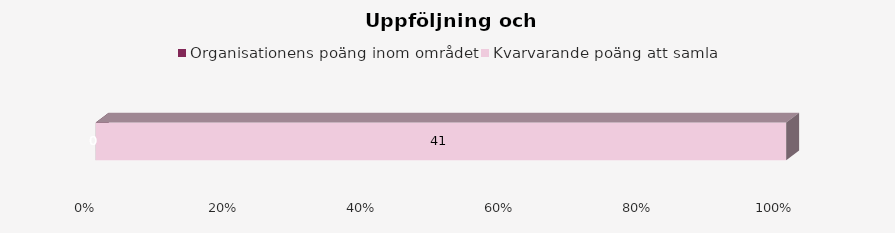
| Category | Organisationens poäng inom området | Kvarvarande poäng att samla |
|---|---|---|
| 0 | 0 | 41 |